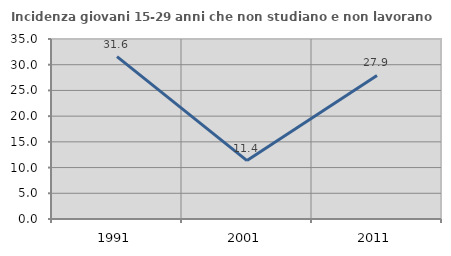
| Category | Incidenza giovani 15-29 anni che non studiano e non lavorano  |
|---|---|
| 1991.0 | 31.579 |
| 2001.0 | 11.364 |
| 2011.0 | 27.907 |